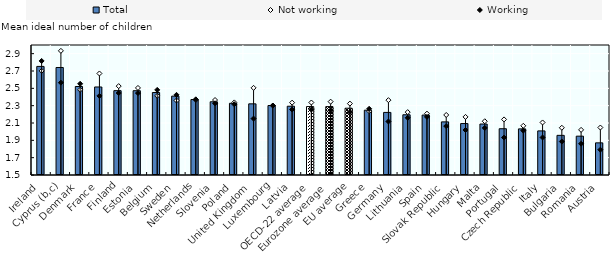
| Category | Total |
|---|---|
| Ireland | 2.753 |
| Cyprus (b,c) | 2.741 |
| Denmark | 2.521 |
| France | 2.516 |
| Finland | 2.473 |
| Estonia | 2.473 |
| Belgium | 2.452 |
| Sweden | 2.41 |
| Netherlands | 2.371 |
| Slovenia | 2.345 |
| Poland | 2.327 |
| United Kingdom | 2.321 |
| Luxembourg | 2.302 |
| Latvia | 2.294 |
| OECD-22 average | 2.29 |
| Eurozone average | 2.289 |
| EU average | 2.27 |
| Greece | 2.248 |
| Germany | 2.222 |
| Lithuania | 2.195 |
| Spain | 2.191 |
| Slovak Republic | 2.113 |
| Hungary | 2.094 |
| Malta | 2.088 |
| Portugal | 2.034 |
| Czech Republic | 2.032 |
| Italy | 2.009 |
| Bulgaria | 1.958 |
| Romania | 1.948 |
| Austria | 1.871 |